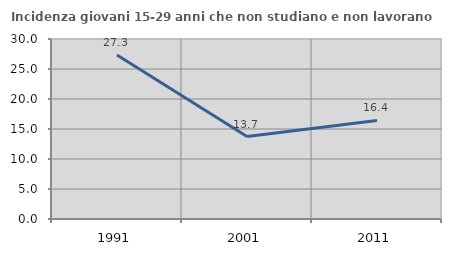
| Category | Incidenza giovani 15-29 anni che non studiano e non lavorano  |
|---|---|
| 1991.0 | 27.341 |
| 2001.0 | 13.749 |
| 2011.0 | 16.433 |